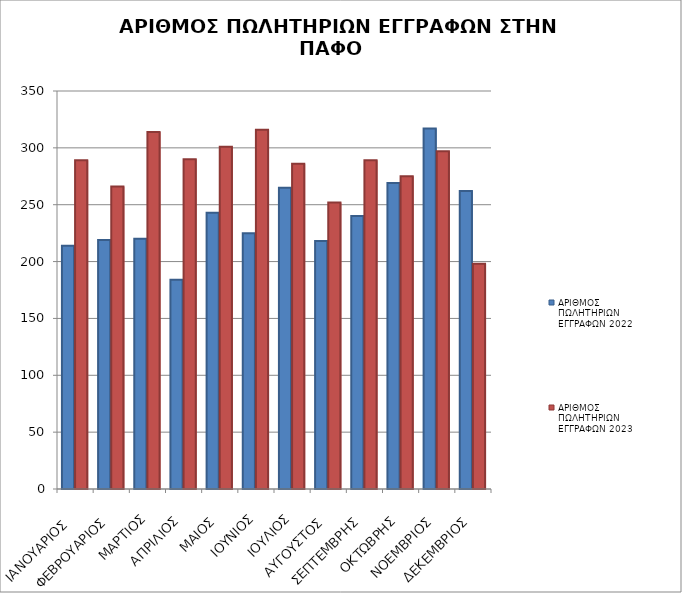
| Category | Συνολικό Αποδεχθέν Ποσό Υποθεσέων Ν81/70 (με επιτόπια έρευνα): | ΑΡΙΘΜΟΣ ΠΩΛΗΤΗΡΙΩΝ ΕΓΓΡΑΦΩΝ 2022 | ΑΡΙΘΜΟΣ ΠΩΛΗΤΗΡΙΩΝ ΕΓΓΡΑΦΩΝ 2023 |
|---|---|---|---|
| ΙΑΝΟΥΑΡΙΟΣ  |  | 214 | 289 |
| ΦΕΒΡΟΥΑΡΙΟΣ |  | 219 | 266 |
| ΜΑΡΤΙΟΣ |  | 220 | 314 |
| ΑΠΡΙΛΙΟΣ |  | 184 | 290 |
| ΜΑΙΟΣ |  | 243 | 301 |
| ΙΟΥΝΙΟΣ |  | 225 | 316 |
| ΙΟΥΛΙΟΣ |  | 265 | 286 |
| ΑΥΓΟΥΣΤΟΣ |  | 218 | 252 |
| ΣΕΠΤΕΜΒΡΗΣ |  | 240 | 289 |
| ΟΚΤΩΒΡΗΣ |  | 269 | 275 |
| ΝΟΕΜΒΡΙΟΣ |  | 317 | 297 |
| ΔΕΚΕΜΒΡΙΟΣ |  | 262 | 198 |